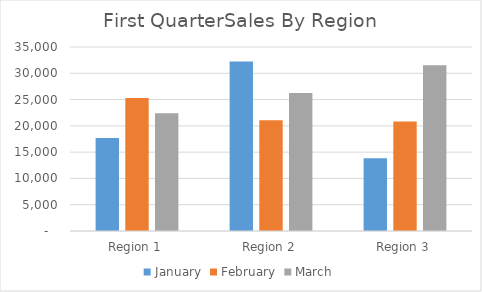
| Category | January | February | March |
|---|---|---|---|
| Region 1 | 17692 | 25304 | 22399 |
| Region 2 | 32219 | 21066 | 26238 |
| Region 3 | 13840 | 20834 | 31520 |